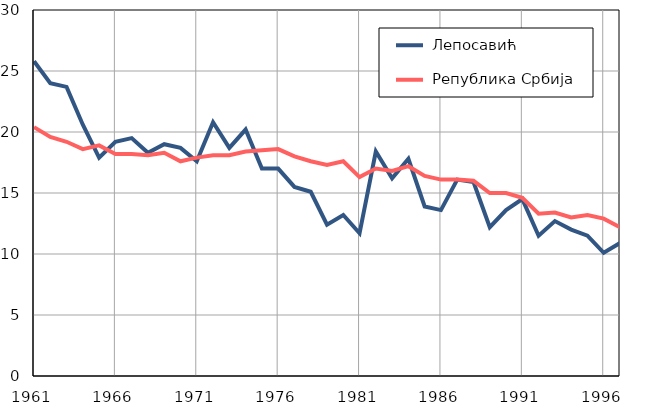
| Category |  Лепосавић |  Република Србија |
|---|---|---|
| 1961.0 | 25.8 | 20.4 |
| 1962.0 | 24 | 19.6 |
| 1963.0 | 23.7 | 19.2 |
| 1964.0 | 20.6 | 18.6 |
| 1965.0 | 17.9 | 18.9 |
| 1966.0 | 19.2 | 18.2 |
| 1967.0 | 19.5 | 18.2 |
| 1968.0 | 18.3 | 18.1 |
| 1969.0 | 19 | 18.3 |
| 1970.0 | 18.7 | 17.6 |
| 1971.0 | 17.6 | 17.9 |
| 1972.0 | 20.8 | 18.1 |
| 1973.0 | 18.7 | 18.1 |
| 1974.0 | 20.2 | 18.4 |
| 1975.0 | 17 | 18.5 |
| 1976.0 | 17 | 18.6 |
| 1977.0 | 15.5 | 18 |
| 1978.0 | 15.1 | 17.6 |
| 1979.0 | 12.4 | 17.3 |
| 1980.0 | 13.2 | 17.6 |
| 1981.0 | 11.7 | 16.3 |
| 1982.0 | 18.4 | 17 |
| 1983.0 | 16.2 | 16.8 |
| 1984.0 | 17.8 | 17.2 |
| 1985.0 | 13.9 | 16.4 |
| 1986.0 | 13.6 | 16.1 |
| 1987.0 | 16.1 | 16.1 |
| 1988.0 | 15.9 | 16 |
| 1989.0 | 12.2 | 15 |
| 1990.0 | 13.6 | 15 |
| 1991.0 | 14.5 | 14.6 |
| 1992.0 | 11.5 | 13.3 |
| 1993.0 | 12.7 | 13.4 |
| 1994.0 | 12 | 13 |
| 1995.0 | 11.5 | 13.2 |
| 1996.0 | 10.1 | 12.9 |
| 1997.0 | 10.9 | 12.2 |